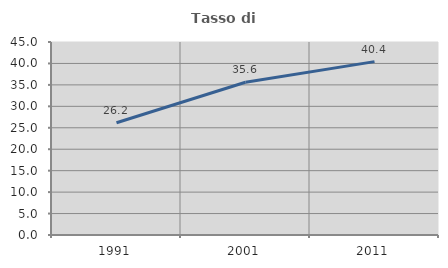
| Category | Tasso di occupazione   |
|---|---|
| 1991.0 | 26.172 |
| 2001.0 | 35.606 |
| 2011.0 | 40.426 |